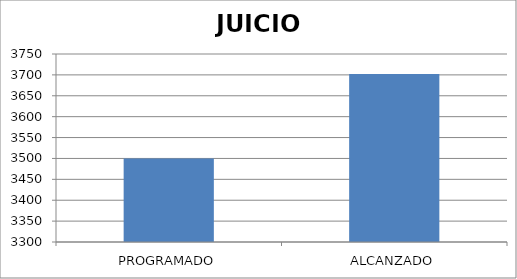
| Category | JUICIO |
|---|---|
| PROGRAMADO | 3500 |
| ALCANZADO | 3702 |